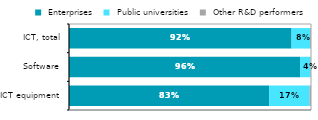
| Category |  Enterprises |  Public universities |  Other R&D performers |
|---|---|---|---|
| ICT equipment | 0.827 | 0.167 | 0.006 |
| Software | 0.956 | 0.041 | 0.002 |
| ICT, total | 0.92 | 0.077 | 0.003 |